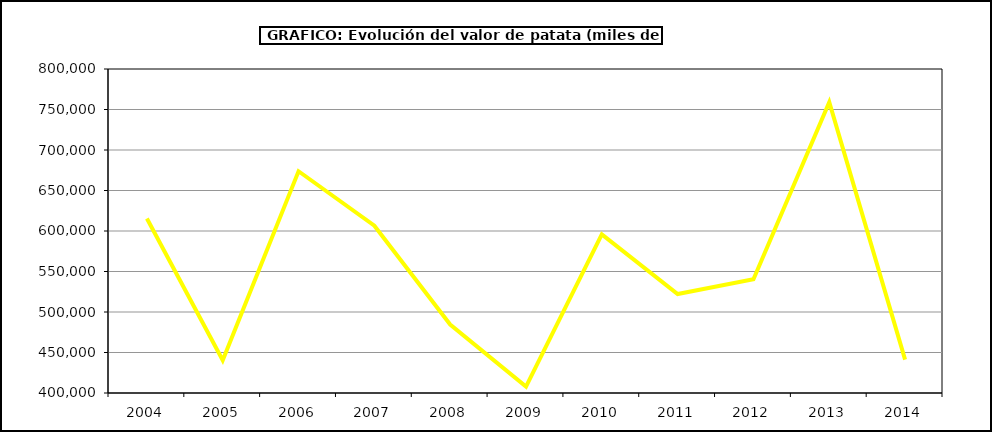
| Category | Valor |
|---|---|
| 2004.0 | 615454.517 |
| 2005.0 | 440403.115 |
| 2006.0 | 673768.768 |
| 2007.0 | 606505.757 |
| 2008.0 | 484594.129 |
| 2009.0 | 407893.65 |
| 2010.0 | 595780.386 |
| 2011.0 | 522199.983 |
| 2012.0 | 540398.006 |
| 2013.0 | 759146.328 |
| 2014.0 | 441131.161 |